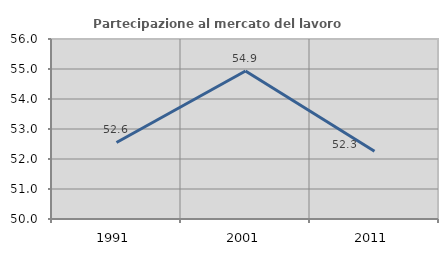
| Category | Partecipazione al mercato del lavoro  femminile |
|---|---|
| 1991.0 | 52.552 |
| 2001.0 | 54.934 |
| 2011.0 | 52.257 |